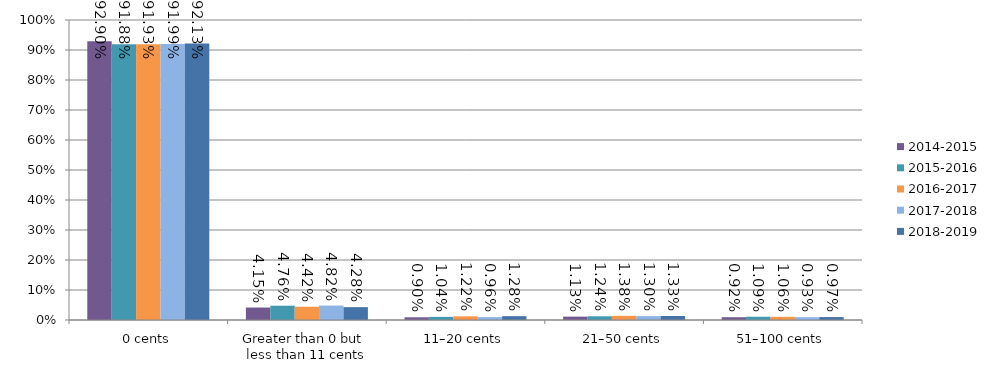
| Category | 2014-2015 | 2015-2016 | 2016-2017 | 2017-2018 | 2018-2019 |
|---|---|---|---|---|---|
| 0 cents | 0.929 | 0.919 | 0.919 | 0.92 | 0.921 |
| Greater than 0 but 
less than 11 cents | 0.042 | 0.048 | 0.044 | 0.048 | 0.043 |
| 11–20 cents | 0.009 | 0.01 | 0.012 | 0.01 | 0.013 |
| 21–50 cents | 0.011 | 0.012 | 0.014 | 0.013 | 0.013 |
| 51–100 cents | 0.009 | 0.011 | 0.011 | 0.009 | 0.01 |